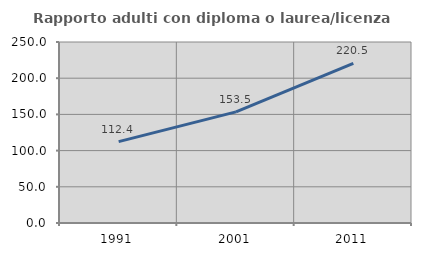
| Category | Rapporto adulti con diploma o laurea/licenza media  |
|---|---|
| 1991.0 | 112.431 |
| 2001.0 | 153.467 |
| 2011.0 | 220.454 |